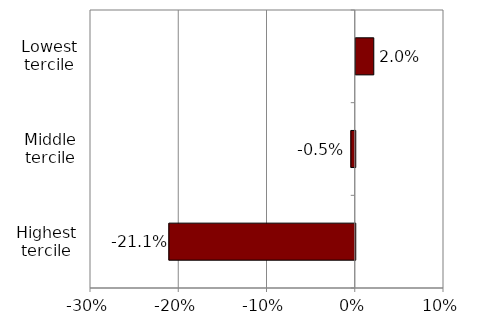
| Category | Series 0 |
|---|---|
| Highest tercile | -0.211 |
| Middle tercile | -0.005 |
| Lowest tercile | 0.02 |